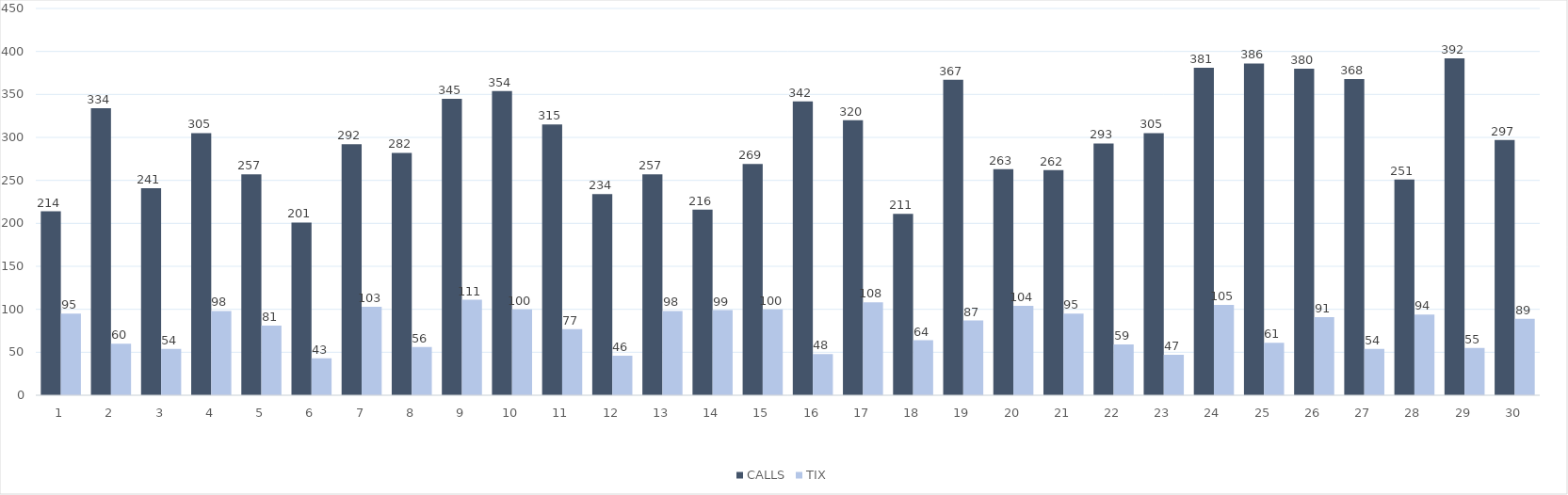
| Category | CALLS | TIX |
|---|---|---|
| 0 | 214 | 95 |
| 1 | 334 | 60 |
| 2 | 241 | 54 |
| 3 | 305 | 98 |
| 4 | 257 | 81 |
| 5 | 201 | 43 |
| 6 | 292 | 103 |
| 7 | 282 | 56 |
| 8 | 345 | 111 |
| 9 | 354 | 100 |
| 10 | 315 | 77 |
| 11 | 234 | 46 |
| 12 | 257 | 98 |
| 13 | 216 | 99 |
| 14 | 269 | 100 |
| 15 | 342 | 48 |
| 16 | 320 | 108 |
| 17 | 211 | 64 |
| 18 | 367 | 87 |
| 19 | 263 | 104 |
| 20 | 262 | 95 |
| 21 | 293 | 59 |
| 22 | 305 | 47 |
| 23 | 381 | 105 |
| 24 | 386 | 61 |
| 25 | 380 | 91 |
| 26 | 368 | 54 |
| 27 | 251 | 94 |
| 28 | 392 | 55 |
| 29 | 297 | 89 |